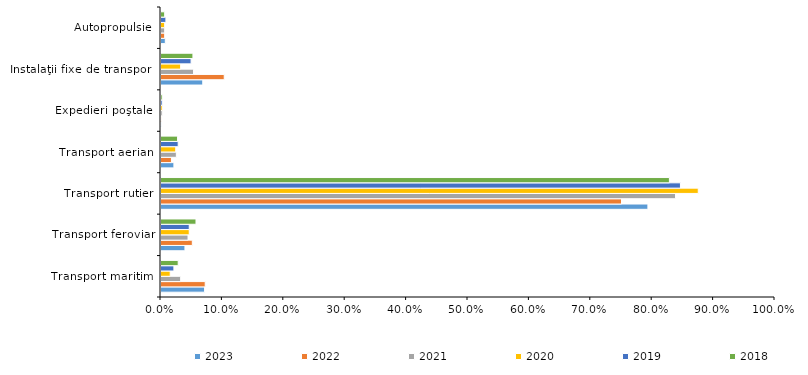
| Category | 2023 | 2022 | 2021 | 2020 | 2019 | 2018 |
|---|---|---|---|---|---|---|
| Transport maritim | 7.1 | 7.2 | 3.2 | 1.5 | 2.1 | 2.8 |
| Transport feroviar | 3.9 | 5.1 | 4.4 | 4.6 | 4.6 | 5.7 |
| Transport rutier | 79.3 | 75 | 83.8 | 87.5 | 84.6 | 82.8 |
| Transport aerian | 2.1 | 1.7 | 2.5 | 2.4 | 2.8 | 2.7 |
| Expedieri poştale | 0.1 | 0.1 | 0.2 | 0.2 | 0.2 | 0.2 |
| Instalaţii fixe de transport | 6.8 | 10.3 | 5.3 | 3.2 | 4.9 | 5.2 |
| Autopropulsie | 0.7 | 0.6 | 0.6 | 0.6 | 0.8 | 0.6 |